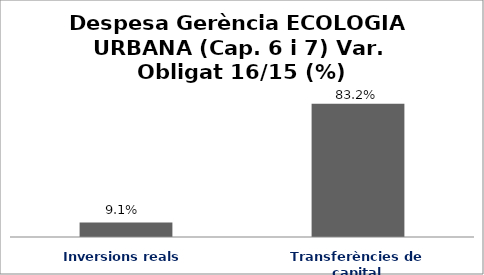
| Category | Series 0 |
|---|---|
| Inversions reals | 0.091 |
| Transferències de capital | 0.832 |